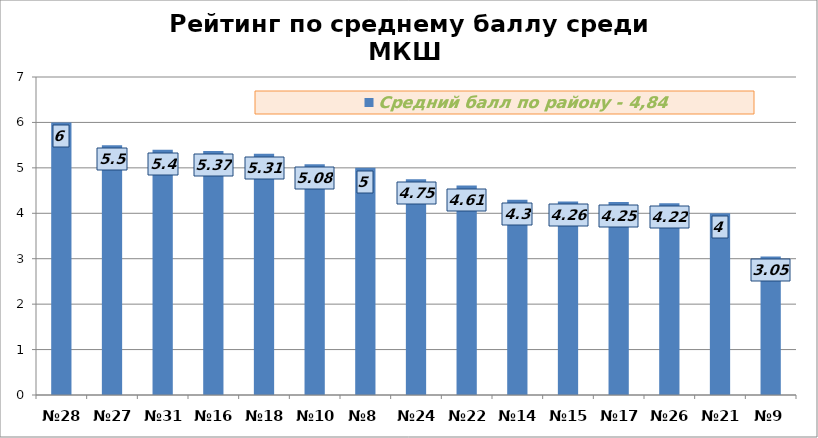
| Category | Средний балл по району - 4,84 |
|---|---|
| №28 | 6 |
| №27 | 5.5 |
| №31 | 5.4 |
| №16 | 5.37 |
| №18 | 5.31 |
| №10 | 5.08 |
| №8 | 5 |
| №24 | 4.75 |
| №22 | 4.61 |
| №14 | 4.3 |
| №15 | 4.26 |
| №17 | 4.25 |
| №26 | 4.22 |
| №21 | 4 |
| №9 | 3.05 |